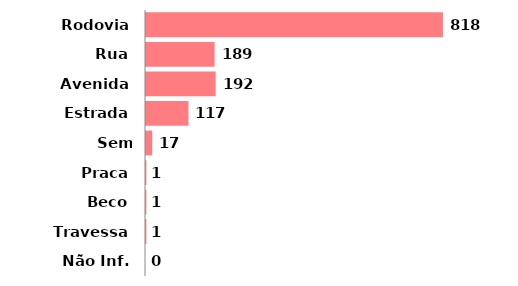
| Category | Qtde |
|---|---|
| Rodovia | 818 |
| Rua | 189 |
| Avenida | 192 |
| Estrada | 117 |
| Sem Referência | 17 |
| Praca | 1 |
| Beco | 1 |
| Travessa | 1 |
| Não Inf. | 0 |